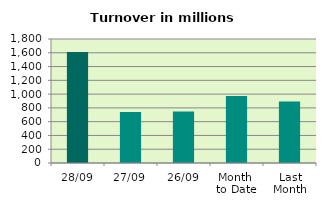
| Category | Series 0 |
|---|---|
| 28/09 | 1611.181 |
| 27/09 | 740.872 |
| 26/09 | 747.93 |
| Month 
to Date | 973.301 |
| Last
Month | 893.956 |